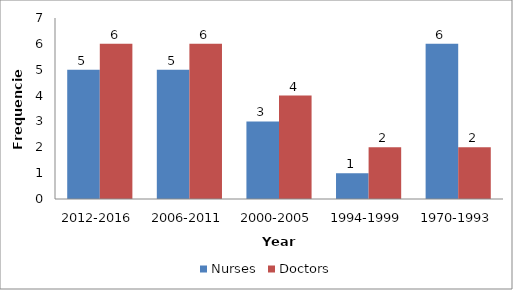
| Category | Nurses | Doctors |
|---|---|---|
| 2012-2016 | 5 | 6 |
| 2006-2011 | 5 | 6 |
| 2000-2005 | 3 | 4 |
| 1994-1999 | 1 | 2 |
| 1970-1993 | 6 | 2 |